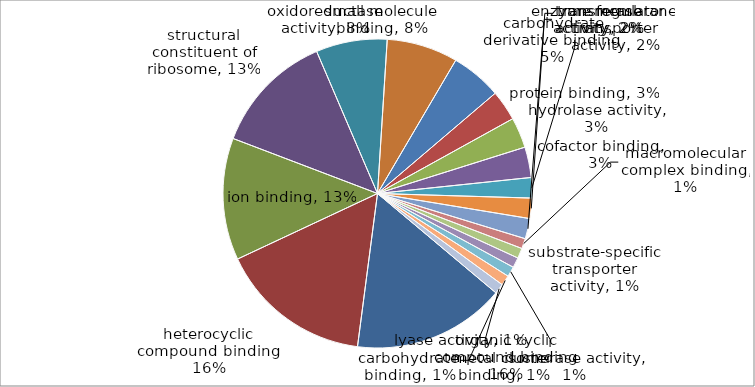
| Category | Series 0 |
|---|---|
| organic cyclic compound binding | 15 |
| heterocyclic compound binding | 15 |
| ion binding | 12 |
| structural constituent of ribosome | 12 |
| oxidoreductase activity | 7 |
| small molecule binding | 7 |
| carbohydrate derivative binding | 5 |
| protein binding | 3 |
| hydrolase activity | 3 |
| cofactor binding | 3 |
| enzyme regulator activity | 2 |
| transferase activity | 2 |
| transmembrane transporter activity | 2 |
| macromolecular complex binding | 1 |
| substrate-specific transporter activity | 1 |
| lyase activity | 1 |
| isomerase activity | 1 |
| carbohydrate binding | 1 |
| metal cluster binding | 1 |